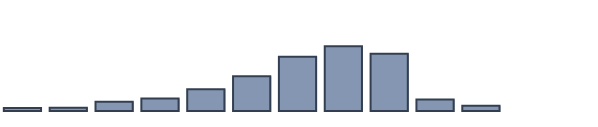
| Category | Series 0 |
|---|---|
| 0 | 1.061 |
| 1 | 1.212 |
| 2 | 3.333 |
| 3 | 4.545 |
| 4 | 7.803 |
| 5 | 12.5 |
| 6 | 19.545 |
| 7 | 23.333 |
| 8 | 20.606 |
| 9 | 4.167 |
| 10 | 1.894 |
| 11 | 0 |
| 12 | 0 |